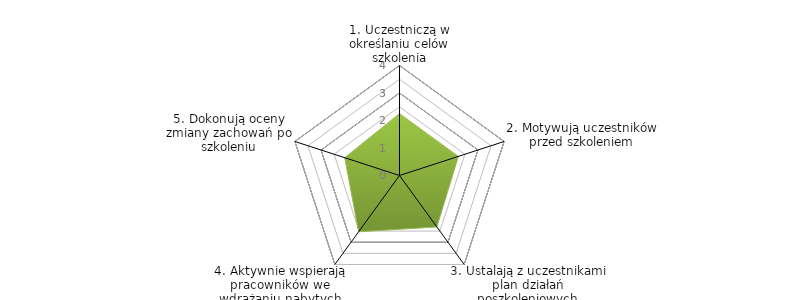
| Category | Series 0 | BENCHMARK |
|---|---|---|
| 1. Uczestniczą w określaniu celów szkolenia |  | 2.25 |
| 2. Motywują uczestników przed szkoleniem |  | 2.25 |
| 3. Ustalają z uczestnikami plan działań poszkoleniowych |  | 2.312 |
| 4. Aktywnie wspierają pracowników we wdrażaniu nabytych kompetencji |  | 2.531 |
| 5. Dokonują oceny zmiany zachowań po szkoleniu |  | 2.094 |